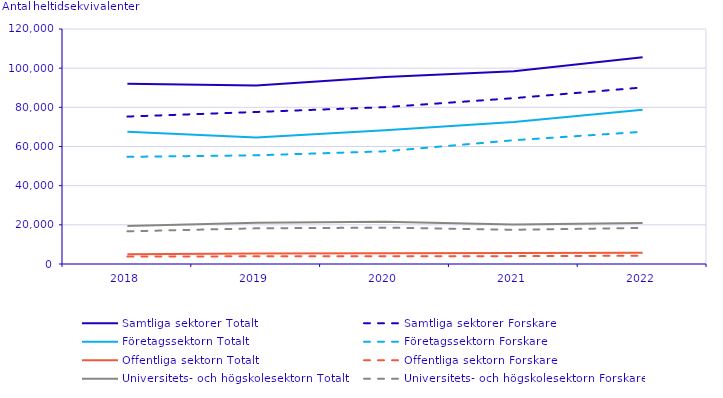
| Category | Samtliga sektorer | Företagssektorn | Offentliga sektorn | Universitets- och högskolesektorn |
|---|---|---|---|---|
| 2018 | 75289 | 54720 | 3838 | 16676 |
| 2019 | 77629 | 55498 | 3914 | 18217 |
| 2020 | 80089 | 57538 | 3980 | 18571 |
| 2021 | 84695 | 63200 | 4011 | 17484 |
| 2022 | 90142 | 67521 | 4212 | 18409 |